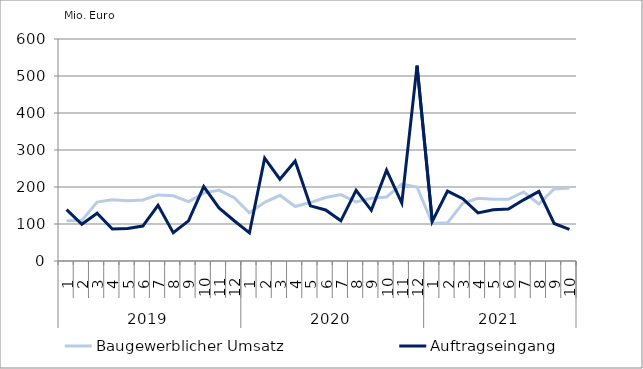
| Category | Baugewerblicher Umsatz | Auftragseingang |
|---|---|---|
| 0 | 108616.605 | 139065.287 |
| 1 | 109331.58 | 99318.609 |
| 2 | 159117.81 | 129002.041 |
| 3 | 165654.287 | 86579.2 |
| 4 | 162976.056 | 87644.362 |
| 5 | 165026.188 | 94463.186 |
| 6 | 178622.938 | 150345.08 |
| 7 | 176074.101 | 76434.317 |
| 8 | 160663.041 | 108444.162 |
| 9 | 183589.485 | 201122.697 |
| 10 | 191777.213 | 143514.792 |
| 11 | 170885.223 | 108780.022 |
| 12 | 130445.562 | 75891.481 |
| 13 | 158433.655 | 277923.85 |
| 14 | 177529.832 | 220973.626 |
| 15 | 147259.799 | 269936.091 |
| 16 | 157965.891 | 149072.895 |
| 17 | 171647.778 | 137984.76 |
| 18 | 179530.732 | 108645.965 |
| 19 | 159480.457 | 190771.468 |
| 20 | 169638.111 | 136988.906 |
| 21 | 173040.053 | 245341.603 |
| 22 | 207619.085 | 156647.224 |
| 23 | 199947.086 | 528166.004 |
| 24 | 101295.895 | 106850.127 |
| 25 | 103236.543 | 188883.434 |
| 26 | 156172.725 | 168204.42 |
| 27 | 169257.088 | 130052.073 |
| 28 | 166897.821 | 138492.214 |
| 29 | 166720.216 | 140262.426 |
| 30 | 186515.191 | 165331.191 |
| 31 | 154188.941 | 188169.655 |
| 32 | 194464.12 | 101359.538 |
| 33 | 197281.201 | 85626.862 |